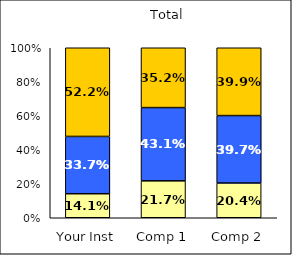
| Category | Low Overall Satisfaction | Average Overall Satisfaction | High Overall Satisfaction |
|---|---|---|---|
| Your Inst | 0.141 | 0.337 | 0.522 |
| Comp 1 | 0.217 | 0.431 | 0.352 |
| Comp 2 | 0.204 | 0.397 | 0.399 |